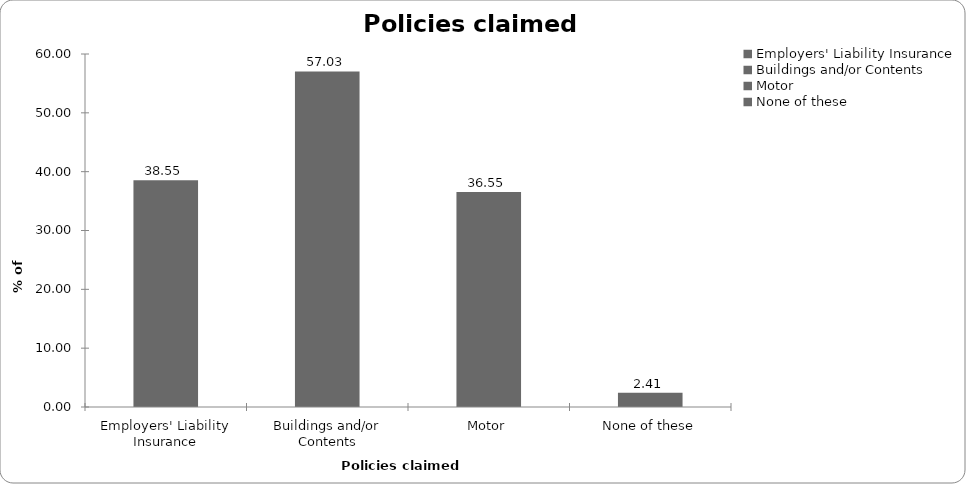
| Category | Series 0 |
|---|---|
| Employers' Liability Insurance | 38.554 |
| Buildings and/or Contents | 57.028 |
| Motor | 36.546 |
| None of these | 2.41 |